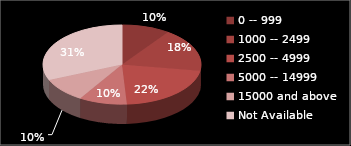
| Category | Series 0 |
|---|---|
| 0 -- 999 | 5 |
| 1000 -- 2499 | 9 |
| 2500 -- 4999 | 11 |
| 5000 -- 14999 | 5 |
| 15000 and above | 5 |
| Not Available | 16 |